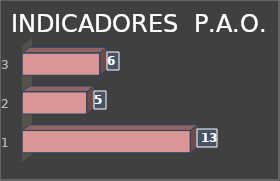
| Category | Series 0 |
|---|---|
| 0 | 13 |
| 1 | 5 |
| 2 | 6 |